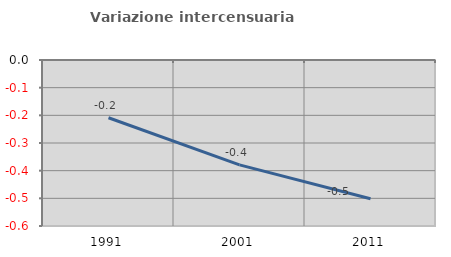
| Category | Variazione intercensuaria annua |
|---|---|
| 1991.0 | -0.209 |
| 2001.0 | -0.379 |
| 2011.0 | -0.501 |